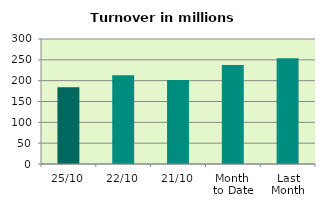
| Category | Series 0 |
|---|---|
| 25/10 | 184.297 |
| 22/10 | 212.707 |
| 21/10 | 201.519 |
| Month 
to Date | 237.745 |
| Last
Month | 253.961 |